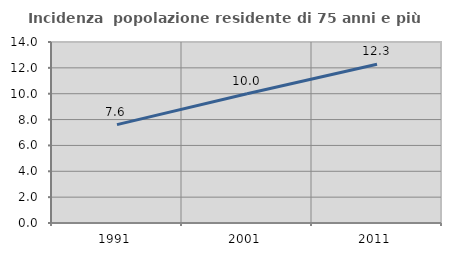
| Category | Incidenza  popolazione residente di 75 anni e più |
|---|---|
| 1991.0 | 7.612 |
| 2001.0 | 10 |
| 2011.0 | 12.275 |